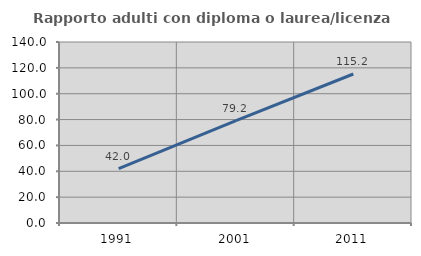
| Category | Rapporto adulti con diploma o laurea/licenza media  |
|---|---|
| 1991.0 | 41.981 |
| 2001.0 | 79.208 |
| 2011.0 | 115.244 |